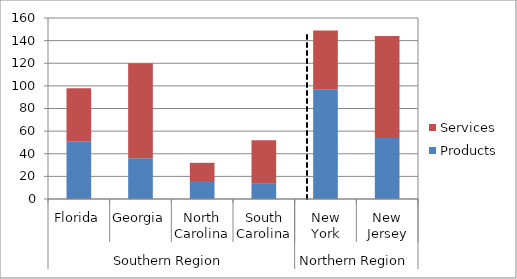
| Category | Products | Services |
|---|---|---|
| 0 | 51 | 47 |
| 1 | 36 | 84 |
| 2 | 15 | 17 |
| 3 | 14 | 38 |
| 4 | 97 | 52 |
| 5 | 54 | 90 |